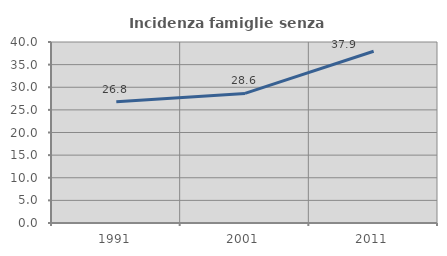
| Category | Incidenza famiglie senza nuclei |
|---|---|
| 1991.0 | 26.786 |
| 2001.0 | 28.634 |
| 2011.0 | 37.945 |